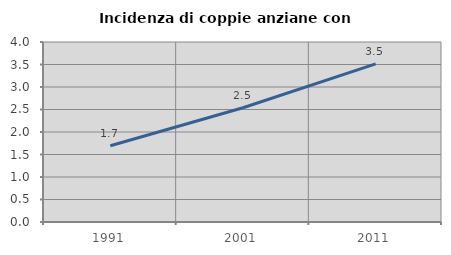
| Category | Incidenza di coppie anziane con figli |
|---|---|
| 1991.0 | 1.695 |
| 2001.0 | 2.538 |
| 2011.0 | 3.513 |